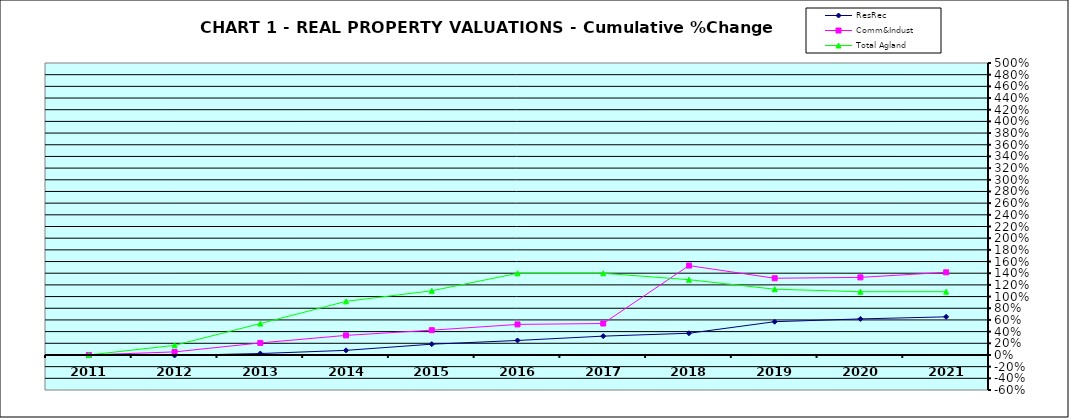
| Category | ResRec | Comm&Indust | Total Agland |
|---|---|---|---|
| 2011.0 | 0 | 0 | 0 |
| 2012.0 | -0.008 | 0.052 | 0.165 |
| 2013.0 | 0.024 | 0.206 | 0.538 |
| 2014.0 | 0.079 | 0.335 | 0.918 |
| 2015.0 | 0.185 | 0.424 | 1.099 |
| 2016.0 | 0.248 | 0.523 | 1.398 |
| 2017.0 | 0.322 | 0.539 | 1.399 |
| 2018.0 | 0.372 | 1.531 | 1.289 |
| 2019.0 | 0.57 | 1.314 | 1.126 |
| 2020.0 | 0.617 | 1.329 | 1.083 |
| 2021.0 | 0.653 | 1.415 | 1.084 |